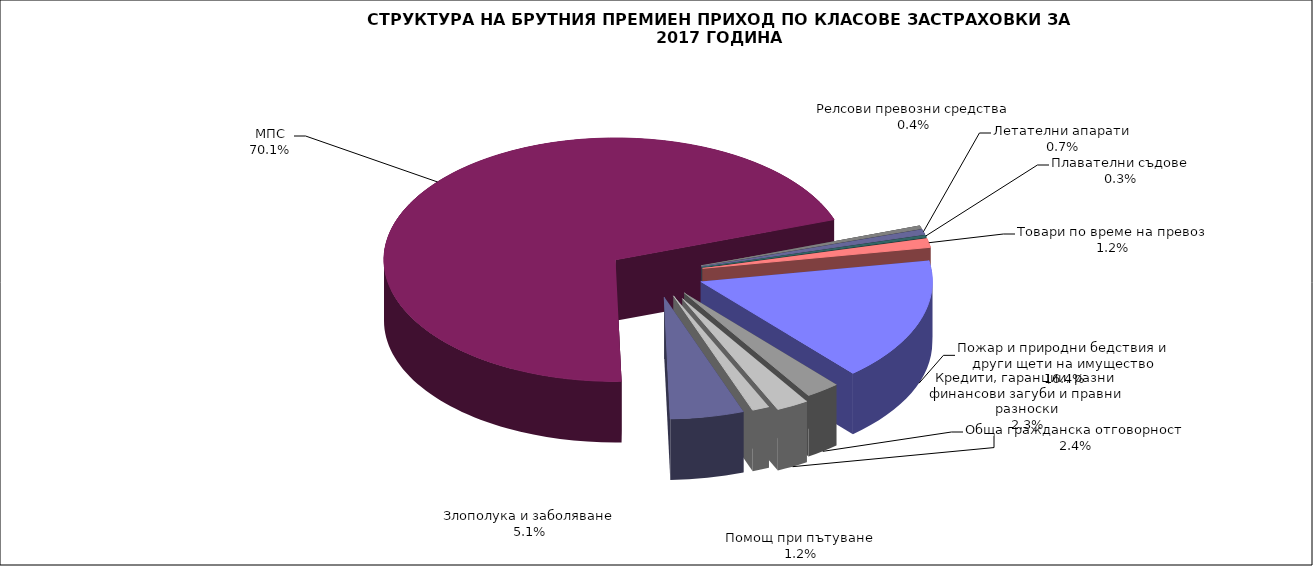
| Category | Series 0 |
|---|---|
| Злополука и заболяване | 0.051 |
| МПС | 0.701 |
| Релсови превозни средства | 0.004 |
| Летателни апарати | 0.007 |
| Плавателни съдове | 0.003 |
| Товари по време на превоз | 0.012 |
| Пожар и природни бедствия и други щети на имущество | 0.164 |
| Обща гражданска отговорност | 0.024 |
| Кредити, гаранции, разни финансови загуби и правни разноски | 0.023 |
| Помощ при пътуване | 0.012 |